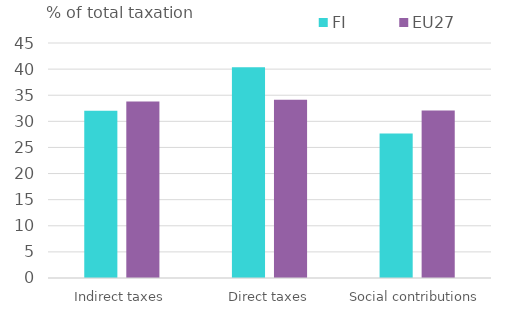
| Category | FI | EU27 |
|---|---|---|
| Indirect taxes | 32.011 | 33.811 |
| Direct taxes | 40.341 | 34.133 |
| Social contributions | 27.648 | 32.056 |